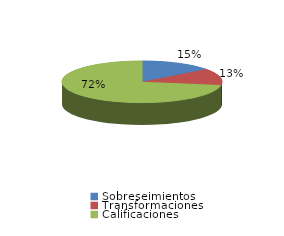
| Category | Series 0 |
|---|---|
| Sobreseimientos | 194 |
| Transformaciones | 170 |
| Calificaciones | 958 |